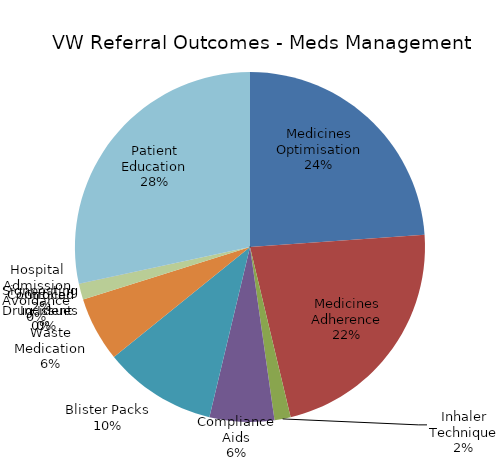
| Category | Series 0 |
|---|---|
| Medicines Optimisation | 16 |
| Medicines Adherence | 15 |
| Inhaler Technique | 1 |
| Compliance Aids | 4 |
| Blister Packs | 7 |
| Waste Medication | 4 |
| Controlled Drug Issues | 0 |
| Critical Incident | 0 |
| Signposting | 1 |
| Hospital Admission Avoidance | 0 |
| Patient Education | 19 |